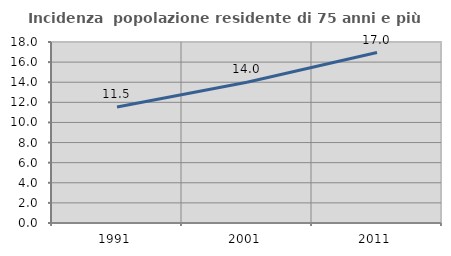
| Category | Incidenza  popolazione residente di 75 anni e più |
|---|---|
| 1991.0 | 11.545 |
| 2001.0 | 13.995 |
| 2011.0 | 16.95 |